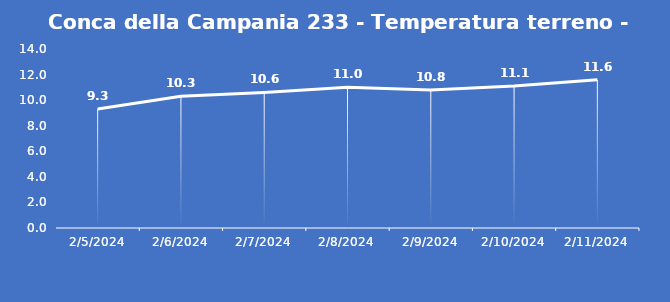
| Category | Conca della Campania 233 - Temperatura terreno - Grezzo (°C) |
|---|---|
| 2/5/24 | 9.3 |
| 2/6/24 | 10.3 |
| 2/7/24 | 10.6 |
| 2/8/24 | 11 |
| 2/9/24 | 10.8 |
| 2/10/24 | 11.1 |
| 2/11/24 | 11.6 |